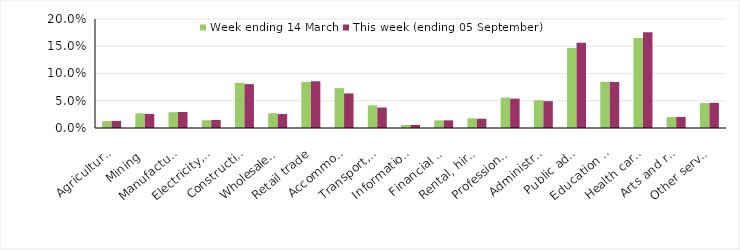
| Category | Week ending 14 March | This week (ending 05 September) |
|---|---|---|
| Agriculture, forestry and fishing | 0.013 | 0.013 |
| Mining | 0.027 | 0.026 |
| Manufacturing | 0.029 | 0.029 |
| Electricity, gas, water and waste services | 0.014 | 0.015 |
| Construction | 0.083 | 0.08 |
| Wholesale trade | 0.027 | 0.026 |
| Retail trade | 0.084 | 0.086 |
| Accommodation and food services | 0.073 | 0.063 |
| Transport, postal and warehousing | 0.042 | 0.038 |
| Information media and telecommunications | 0.006 | 0.006 |
| Financial and insurance services | 0.014 | 0.014 |
| Rental, hiring and real estate services | 0.018 | 0.017 |
| Professional, scientific and technical services | 0.056 | 0.054 |
| Administrative and support services | 0.051 | 0.049 |
| Public administration and safety | 0.147 | 0.156 |
| Education and training | 0.085 | 0.084 |
| Health care and social assistance | 0.165 | 0.176 |
| Arts and recreation services | 0.02 | 0.02 |
| Other services | 0.046 | 0.046 |